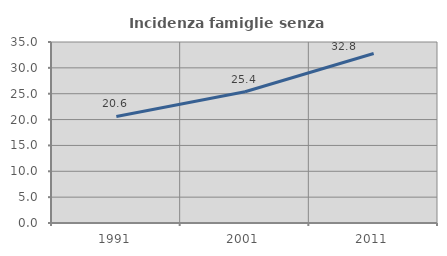
| Category | Incidenza famiglie senza nuclei |
|---|---|
| 1991.0 | 20.607 |
| 2001.0 | 25.369 |
| 2011.0 | 32.78 |